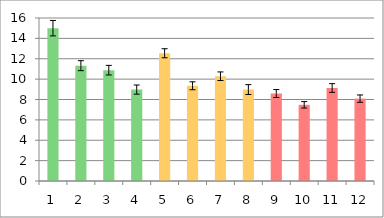
| Category | Series 0 |
|---|---|
| 0 | 15 |
| 1 | 11.32 |
| 2 | 10.88 |
| 3 | 8.973 |
| 4 | 12.54 |
| 5 | 9.347 |
| 6 | 10.286 |
| 7 | 8.974 |
| 8 | 8.588 |
| 9 | 7.479 |
| 10 | 9.13 |
| 11 | 8.087 |